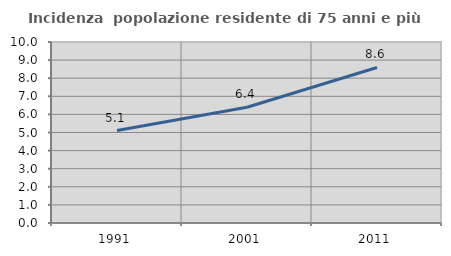
| Category | Incidenza  popolazione residente di 75 anni e più |
|---|---|
| 1991.0 | 5.106 |
| 2001.0 | 6.397 |
| 2011.0 | 8.593 |